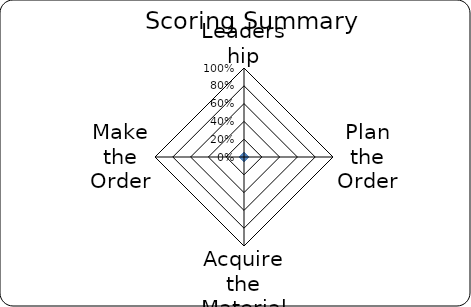
| Category | Series 0 |
|---|---|
| Leadership | 0 |
| Plan the Order | 0 |
| Acquire the Material | 0 |
| Make the Order | 0 |